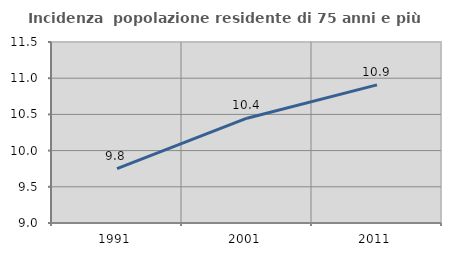
| Category | Incidenza  popolazione residente di 75 anni e più |
|---|---|
| 1991.0 | 9.751 |
| 2001.0 | 10.448 |
| 2011.0 | 10.907 |